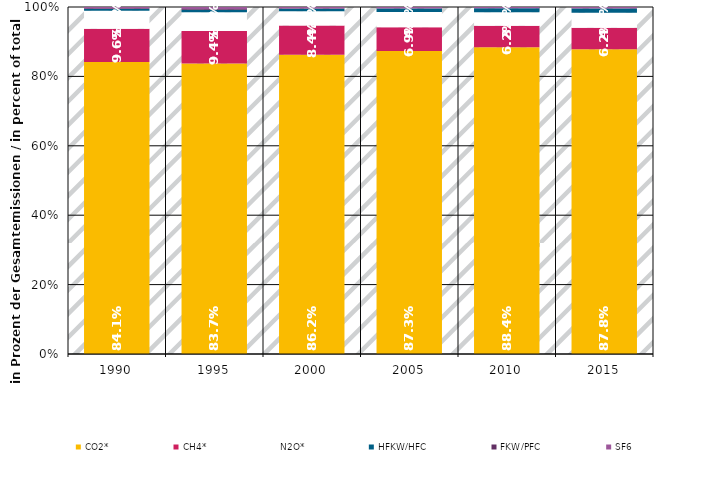
| Category | CO2* | CH4* | N2O* | HFKW/HFC | FKW/PFC | SF6 |
|---|---|---|---|---|---|---|
| 1990.0 | 0.841 | 0.096 | 0.052 | 0.005 | 0.002 | 0.004 |
| 1995.0 | 0.837 | 0.094 | 0.054 | 0.007 | 0.002 | 0.006 |
| 2000.0 | 0.862 | 0.084 | 0.041 | 0.007 | 0.001 | 0.004 |
| 2005.0 | 0.873 | 0.069 | 0.044 | 0.01 | 0.001 | 0.003 |
| 2010.0 | 0.884 | 0.062 | 0.039 | 0.011 | 0 | 0.003 |
| 2015.0 | 0.878 | 0.062 | 0.043 | 0.013 | 0 | 0.004 |